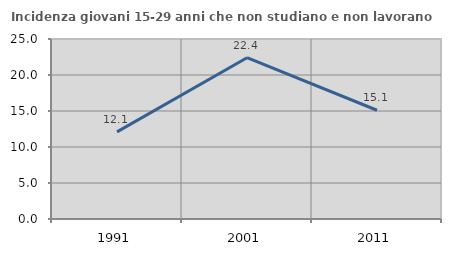
| Category | Incidenza giovani 15-29 anni che non studiano e non lavorano  |
|---|---|
| 1991.0 | 12.094 |
| 2001.0 | 22.404 |
| 2011.0 | 15.104 |